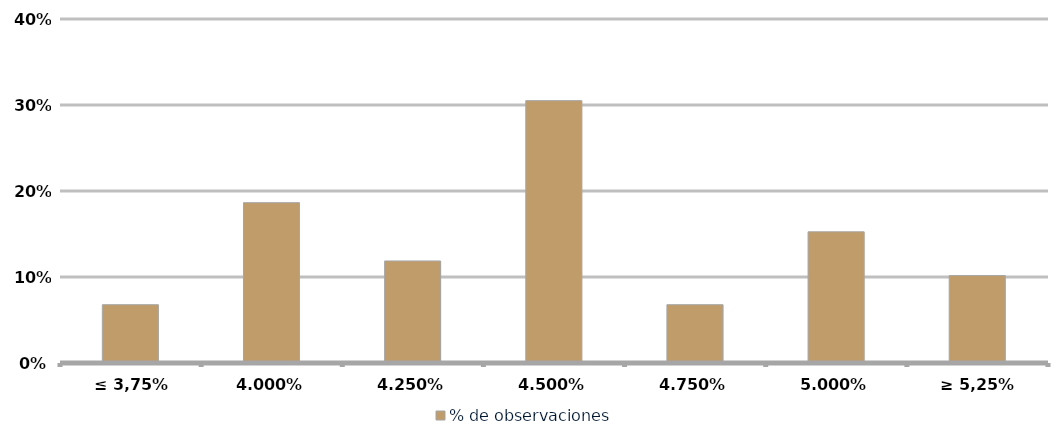
| Category | % de observaciones  |
|---|---|
| ≤ 3,75% | 0.068 |
| 4,00% | 0.186 |
| 4,25% | 0.119 |
| 4,50% | 0.305 |
| 4,75% | 0.068 |
| 5,00% | 0.153 |
| ≥ 5,25% | 0.102 |